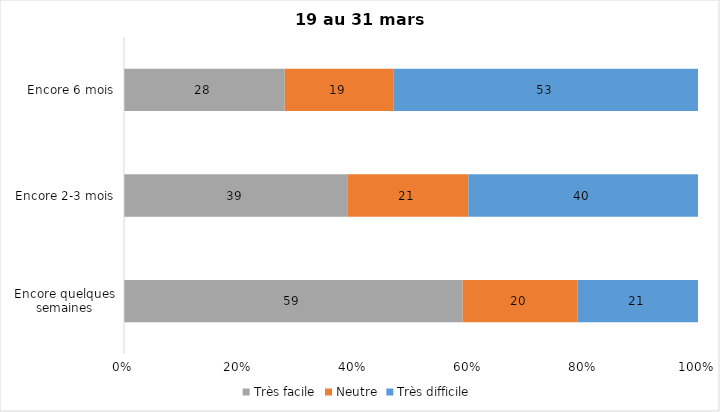
| Category | Très facile | Neutre | Très difficile |
|---|---|---|---|
| Encore quelques semaines | 59 | 20 | 21 |
| Encore 2-3 mois | 39 | 21 | 40 |
| Encore 6 mois | 28 | 19 | 53 |